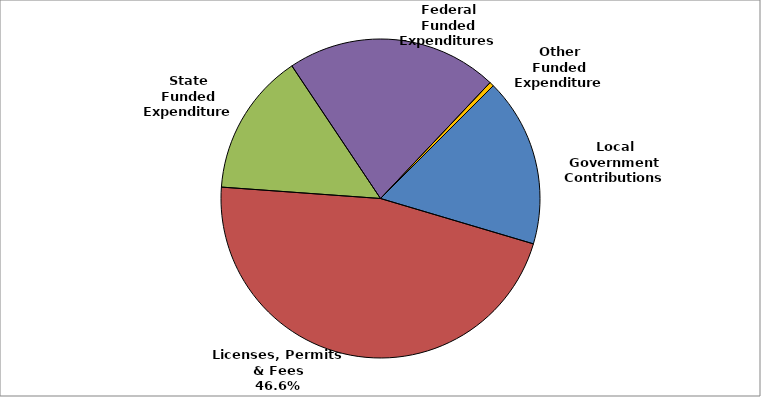
| Category | Series 0 |
|---|---|
| Local Government Contributions | 0.171 |
| Licenses, Permits & Fees | 0.465 |
| State Funded Expenditures | 0.145 |
| Federal Funded Expenditures | 0.214 |
| Other Funded Expenditures | 0.004 |